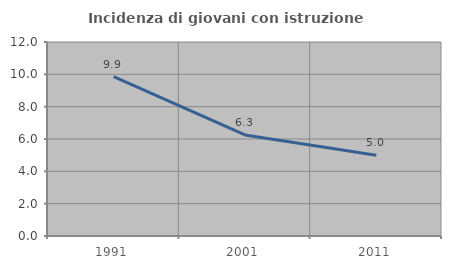
| Category | Incidenza di giovani con istruzione universitaria |
|---|---|
| 1991.0 | 9.859 |
| 2001.0 | 6.25 |
| 2011.0 | 5 |